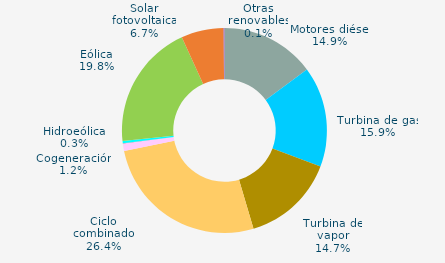
| Category | Series 0 |
|---|---|
| Motores diésel | 14.859 |
| Turbina de gas | 15.867 |
| Turbina de vapor | 14.706 |
| Ciclo combinado | 26.369 |
| Cogeneración | 1.164 |
| Hidráulica | 0.046 |
| Hidroeólica | 0.345 |
| Eólica | 19.812 |
| Solar fotovoltaica | 6.689 |
| Otras renovables | 0.143 |